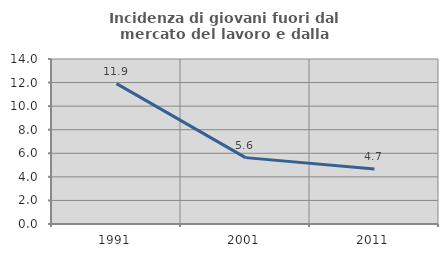
| Category | Incidenza di giovani fuori dal mercato del lavoro e dalla formazione  |
|---|---|
| 1991.0 | 11.908 |
| 2001.0 | 5.632 |
| 2011.0 | 4.67 |